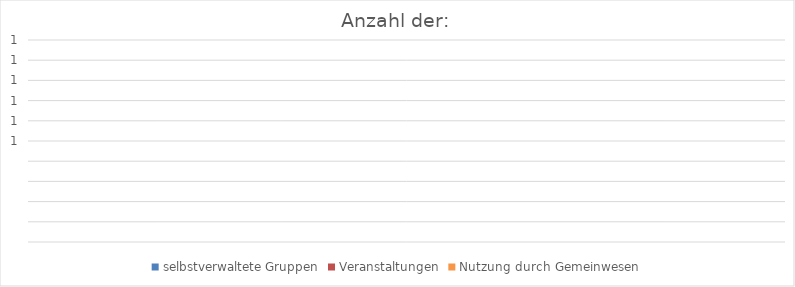
| Category | selbstverwaltete Gruppen | Veranstaltungen | Nutzung durch Gemeinwesen |
|---|---|---|---|
| 0 | 0 | 0 | 0 |